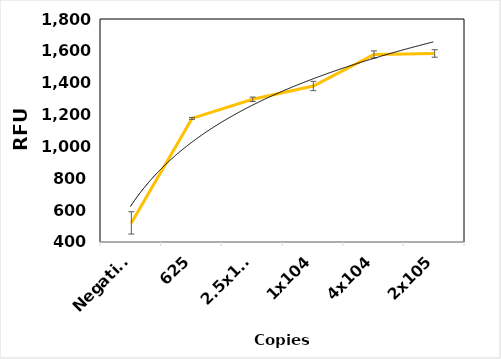
| Category | RFU |
|---|---|
| Negative | 520 |
| 625 | 1176 |
| 2.5x103 | 1296 |
| 1x104 | 1379.333 |
| 4x104 | 1577.333 |
| 2x105 | 1583.667 |